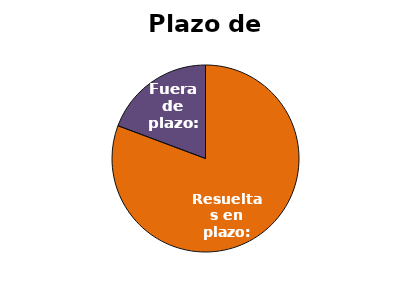
| Category | Series 0 |
|---|---|
| Resueltas en plazo: | 46 |
| Fuera de plazo: | 11 |